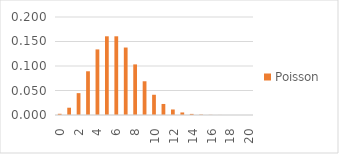
| Category | Poisson |
|---|---|
| 0.0 | 0.002 |
| 1.0 | 0.015 |
| 2.0 | 0.045 |
| 3.0 | 0.089 |
| 4.0 | 0.134 |
| 5.0 | 0.161 |
| 6.0 | 0.161 |
| 7.0 | 0.138 |
| 8.0 | 0.103 |
| 9.0 | 0.069 |
| 10.0 | 0.041 |
| 11.0 | 0.023 |
| 12.0 | 0.011 |
| 13.0 | 0.005 |
| 14.0 | 0.002 |
| 15.0 | 0.001 |
| 16.0 | 0 |
| 17.0 | 0 |
| 18.0 | 0 |
| 19.0 | 0 |
| 20.0 | 0 |